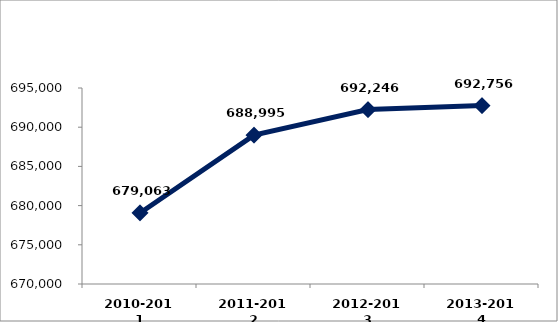
| Category | Series 0 |
|---|---|
| 2010-2011 | 679063 |
| 2011-2012 | 688995 |
| 2012-2013 | 692246 |
| 2013-2014 | 692756 |